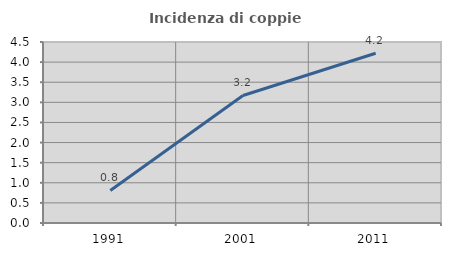
| Category | Incidenza di coppie miste |
|---|---|
| 1991.0 | 0.809 |
| 2001.0 | 3.171 |
| 2011.0 | 4.219 |